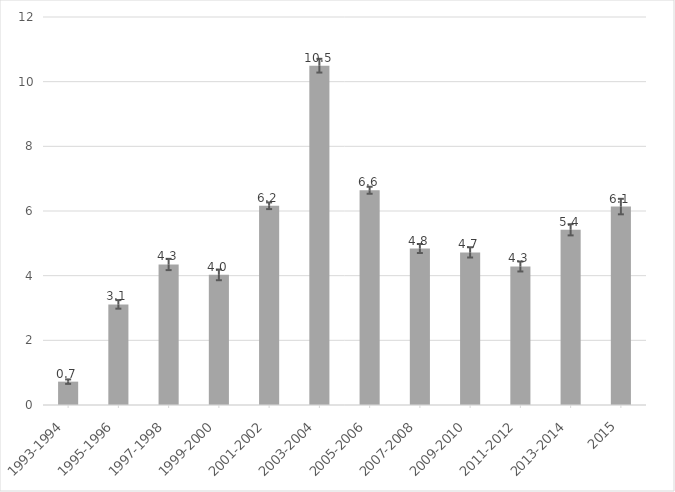
| Category | Series 0 |
|---|---|
| 1993-1994 | 0.722 |
| 1995-1996 | 3.112 |
| 1997-1998 | 4.346 |
| 1999-2000 | 4.025 |
| 2001-2002 | 6.162 |
| 2003-2004 | 10.494 |
| 2005-2006 | 6.642 |
| 2007-2008 | 4.84 |
| 2009-2010 | 4.72 |
| 2011-2012 | 4.284 |
| 2013-2014 | 5.419 |
| 2015 | 6.137 |